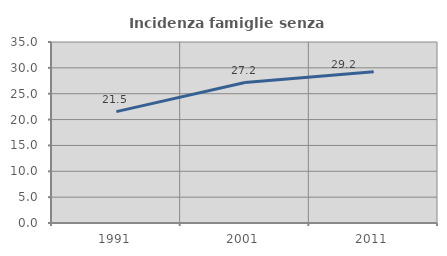
| Category | Incidenza famiglie senza nuclei |
|---|---|
| 1991.0 | 21.534 |
| 2001.0 | 27.159 |
| 2011.0 | 29.228 |